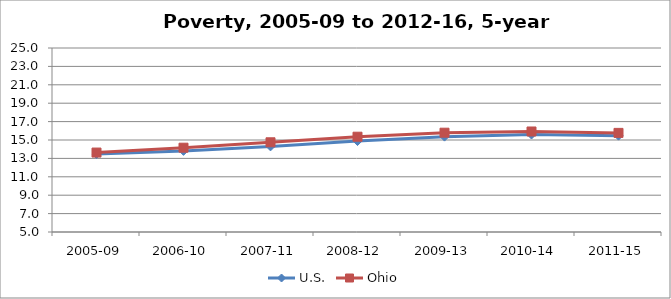
| Category | U.S. | Ohio |
|---|---|---|
| 2005-09 | 13.471 | 13.635 |
| 2006-10 | 13.817 | 14.164 |
| 2007-11 | 14.304 | 14.752 |
| 2008-12 | 14.885 | 15.357 |
| 2009-13 | 15.365 | 15.795 |
| 2010-14 | 15.595 | 15.925 |
| 2011-15 | 15.472 | 15.773 |